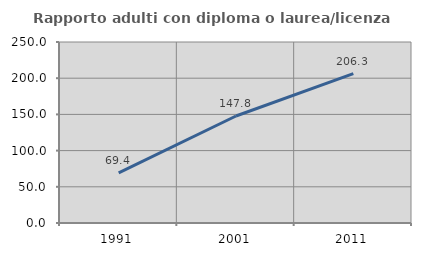
| Category | Rapporto adulti con diploma o laurea/licenza media  |
|---|---|
| 1991.0 | 69.355 |
| 2001.0 | 147.761 |
| 2011.0 | 206.349 |